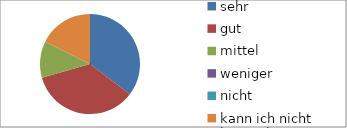
| Category | Series 0 |
|---|---|
| sehr | 6 |
| gut | 6 |
| mittel | 2 |
| weniger | 0 |
| nicht | 0 |
| kann ich nicht beurteilen | 3 |
| keine Angabe | 0 |